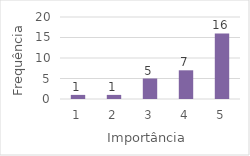
| Category | Series 0 |
|---|---|
| 1.0 | 1 |
| 2.0 | 1 |
| 3.0 | 5 |
| 4.0 | 7 |
| 5.0 | 16 |